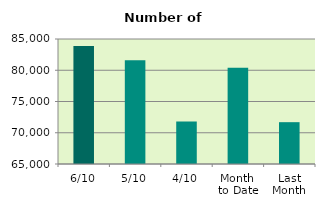
| Category | Series 0 |
|---|---|
| 6/10 | 83880 |
| 5/10 | 81586 |
| 4/10 | 71806 |
| Month 
to Date | 80411.5 |
| Last
Month | 71692 |